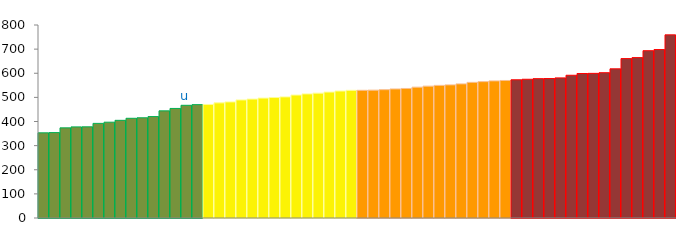
| Category | Top Quartile | 2nd Quartile | 3rd Quartile | Bottom Quartile | Series 4 |
|---|---|---|---|---|---|
|  | 353 | 0 | 0 | 0 | 353 |
|  | 354 | 0 | 0 | 0 | 354 |
|  | 373.6 | 0 | 0 | 0 | 373.6 |
|  | 377.7 | 0 | 0 | 0 | 377.7 |
|  | 377.9 | 0 | 0 | 0 | 377.9 |
|  | 392.2 | 0 | 0 | 0 | 392.2 |
|  | 397.1 | 0 | 0 | 0 | 397.1 |
|  | 404.8 | 0 | 0 | 0 | 404.8 |
|  | 413.3 | 0 | 0 | 0 | 413.3 |
|  | 415.4 | 0 | 0 | 0 | 415.4 |
|  | 420.4 | 0 | 0 | 0 | 420.4 |
|  | 444.1 | 0 | 0 | 0 | 444.1 |
|  | 454.1 | 0 | 0 | 0 | 454.1 |
| u | 467.1 | 0 | 0 | 0 | 467.1 |